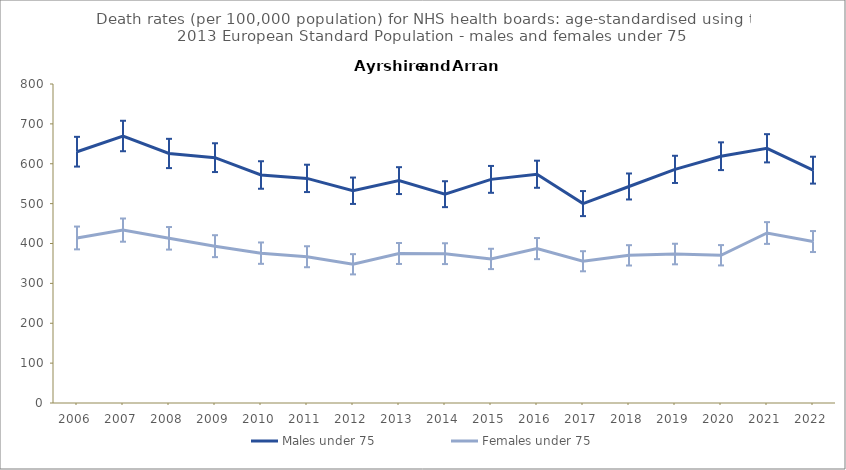
| Category | Males under 75 | Females under 75 |
|---|---|---|
| 2006.0 | 630.2 | 413.9 |
| 2007.0 | 669.6 | 433.6 |
| 2008.0 | 625.8 | 413 |
| 2009.0 | 615.3 | 393.3 |
| 2010.0 | 571.8 | 375.8 |
| 2011.0 | 563.3 | 366.8 |
| 2012.0 | 532.3 | 347.9 |
| 2013.0 | 557.7 | 375 |
| 2014.0 | 523.7 | 374.5 |
| 2015.0 | 560.8 | 361.3 |
| 2016.0 | 573.7 | 387.2 |
| 2017.0 | 500.1 | 355.5 |
| 2018.0 | 543 | 370.3 |
| 2019.0 | 585.9 | 373.6 |
| 2020.0 | 618.9 | 370.5 |
| 2021.0 | 638.8 | 426.3 |
| 2022.0 | 583.9 | 404.9 |